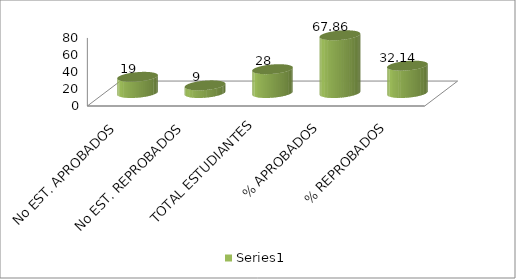
| Category | Series 0 |
|---|---|
| No EST. APROBADOS | 19 |
| No EST. REPROBADOS | 9 |
| TOTAL ESTUDIANTES | 28 |
| % APROBADOS | 67.857 |
| % REPROBADOS | 32.143 |